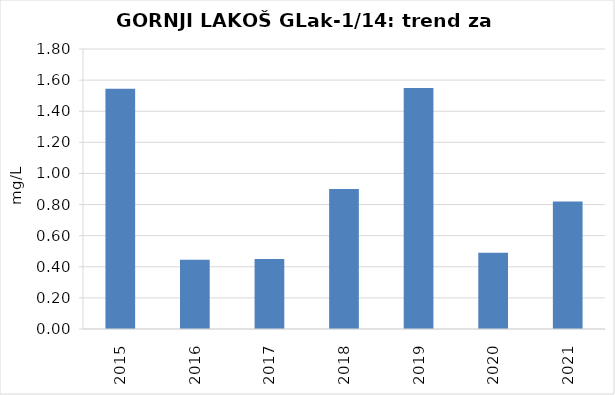
| Category | Vsota |
|---|---|
| 2015 | 1.545 |
| 2016 | 0.445 |
| 2017 | 0.45 |
| 2018 | 0.9 |
| 2019 | 1.55 |
| 2020 | 0.49 |
| 2021 | 0.82 |